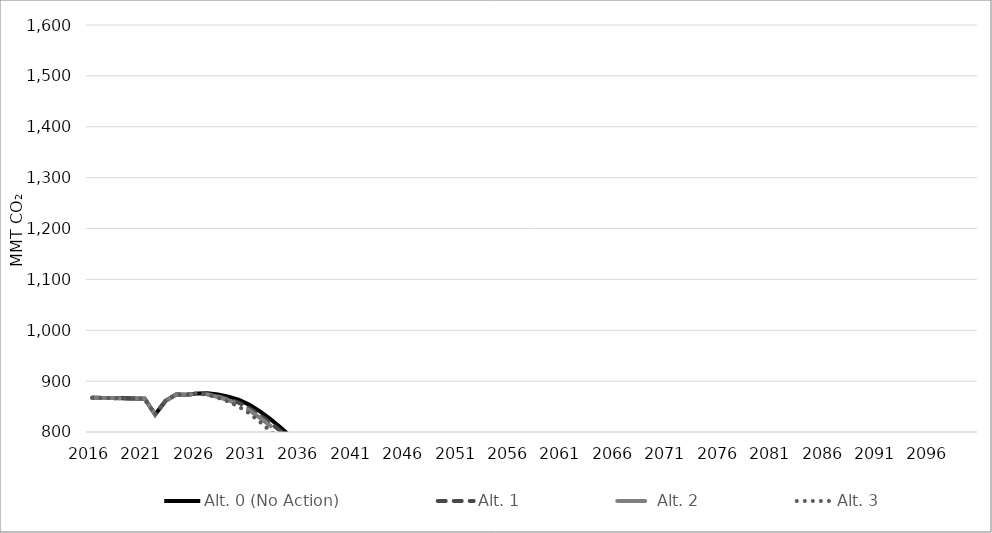
| Category | Alt. 0 (No Action) | Alt. 1 | Alt. 2 | Alt. 3 |
|---|---|---|---|---|
| 2016.0 | 867.375 | 867.375 | 867.375 | 867.375 |
| 2017.0 | 866.991 | 866.991 | 866.991 | 866.991 |
| 2018.0 | 866.606 | 866.606 | 866.606 | 866.606 |
| 2019.0 | 866.222 | 866.222 | 866.222 | 866.222 |
| 2020.0 | 865.838 | 865.838 | 865.838 | 865.838 |
| 2021.0 | 865.454 | 865.454 | 865.454 | 865.454 |
| 2022.0 | 834.271 | 834.271 | 834.271 | 834.271 |
| 2023.0 | 861.392 | 861.392 | 861.392 | 861.392 |
| 2024.0 | 873.777 | 873.777 | 873.777 | 873.777 |
| 2025.0 | 873.247 | 873.247 | 873.247 | 873.247 |
| 2026.0 | 875.583 | 875.583 | 875.583 | 875.583 |
| 2027.0 | 876.187 | 874.513 | 873.795 | 873.157 |
| 2028.0 | 873.704 | 870.343 | 868.748 | 867.291 |
| 2029.0 | 869.421 | 864.51 | 862.054 | 859.611 |
| 2030.0 | 863.177 | 857.358 | 854.022 | 849.724 |
| 2031.0 | 853.374 | 846.585 | 842.424 | 836.229 |
| 2032.0 | 840.499 | 832.85 | 827.79 | 819.822 |
| 2033.0 | 825.172 | 817.636 | 812.159 | 801.88 |
| 2034.0 | 808.401 | 801.258 | 795.371 | 782.746 |
| 2035.0 | 790.051 | 783.287 | 777.024 | 762.148 |
| 2036.0 | 772.213 | 765.639 | 759.127 | 741.909 |
| 2037.0 | 753.615 | 747.206 | 740.468 | 721.394 |
| 2038.0 | 735.428 | 729.408 | 722.591 | 701.757 |
| 2039.0 | 716.83 | 710.918 | 703.261 | 681.316 |
| 2040.0 | 696.609 | 690.644 | 682.365 | 659.487 |
| 2041.0 | 677.78 | 671.948 | 662.789 | 639.41 |
| 2042.0 | 659.316 | 653.775 | 644.041 | 619.892 |
| 2043.0 | 641.708 | 636.558 | 626.21 | 601.31 |
| 2044.0 | 623.161 | 618.299 | 607.033 | 581.859 |
| 2045.0 | 601.755 | 598.169 | 586.441 | 561.532 |
| 2046.0 | 579.557 | 577.342 | 565.676 | 540.185 |
| 2047.0 | 557.734 | 556.915 | 545.265 | 519.309 |
| 2048.0 | 536.37 | 537.001 | 525.39 | 498.676 |
| 2049.0 | 513.319 | 515.178 | 503.912 | 476.834 |
| 2050.0 | 489.345 | 492.167 | 481.575 | 454.411 |
| 2051.0 | 489.093 | 491.914 | 481.327 | 454.177 |
| 2052.0 | 488.842 | 491.661 | 481.08 | 453.944 |
| 2053.0 | 488.59 | 491.408 | 480.832 | 453.71 |
| 2054.0 | 488.339 | 491.155 | 480.585 | 453.477 |
| 2055.0 | 488.087 | 490.902 | 480.337 | 453.243 |
| 2056.0 | 487.836 | 490.65 | 480.09 | 453.01 |
| 2057.0 | 487.584 | 490.397 | 479.842 | 452.776 |
| 2058.0 | 487.333 | 490.144 | 479.595 | 452.542 |
| 2059.0 | 487.081 | 489.891 | 479.347 | 452.309 |
| 2060.0 | 486.83 | 489.638 | 479.1 | 452.075 |
| 2061.0 | 486.578 | 489.385 | 478.852 | 451.842 |
| 2062.0 | 486.327 | 489.132 | 478.605 | 451.608 |
| 2063.0 | 486.075 | 488.879 | 478.357 | 451.375 |
| 2064.0 | 485.824 | 488.626 | 478.11 | 451.141 |
| 2065.0 | 485.572 | 488.373 | 477.862 | 450.908 |
| 2066.0 | 485.427 | 488.227 | 477.72 | 450.773 |
| 2067.0 | 485.282 | 488.081 | 477.577 | 450.638 |
| 2068.0 | 485.137 | 487.935 | 477.434 | 450.504 |
| 2069.0 | 484.992 | 487.789 | 477.291 | 450.369 |
| 2070.0 | 484.847 | 487.644 | 477.149 | 450.234 |
| 2071.0 | 484.702 | 487.498 | 477.006 | 450.099 |
| 2072.0 | 484.557 | 487.352 | 476.863 | 449.965 |
| 2073.0 | 484.412 | 487.206 | 476.72 | 449.83 |
| 2074.0 | 484.267 | 487.06 | 476.578 | 449.695 |
| 2075.0 | 484.122 | 486.914 | 476.435 | 449.561 |
| 2076.0 | 483.977 | 486.768 | 476.292 | 449.426 |
| 2077.0 | 483.831 | 486.622 | 476.149 | 449.291 |
| 2078.0 | 483.686 | 486.476 | 476.007 | 449.157 |
| 2079.0 | 483.541 | 486.33 | 475.864 | 449.022 |
| 2080.0 | 483.396 | 486.185 | 475.721 | 448.887 |
| 2081.0 | 481.143 | 483.919 | 473.504 | 446.795 |
| 2082.0 | 478.89 | 481.653 | 471.287 | 444.703 |
| 2083.0 | 476.638 | 479.387 | 469.07 | 442.611 |
| 2084.0 | 474.385 | 477.121 | 466.852 | 440.519 |
| 2085.0 | 472.132 | 474.855 | 464.635 | 438.427 |
| 2086.0 | 469.879 | 472.589 | 462.418 | 436.335 |
| 2087.0 | 467.626 | 470.323 | 460.201 | 434.242 |
| 2088.0 | 465.373 | 468.057 | 457.984 | 432.15 |
| 2089.0 | 463.12 | 465.791 | 455.767 | 430.058 |
| 2090.0 | 460.867 | 463.525 | 453.55 | 427.966 |
| 2091.0 | 458.614 | 461.259 | 451.332 | 425.874 |
| 2092.0 | 456.361 | 458.994 | 449.115 | 423.782 |
| 2093.0 | 454.108 | 456.728 | 446.898 | 421.69 |
| 2094.0 | 451.855 | 454.462 | 444.681 | 419.598 |
| 2095.0 | 449.602 | 452.196 | 442.464 | 417.506 |
| 2096.0 | 449.602 | 452.196 | 442.464 | 417.506 |
| 2097.0 | 449.602 | 452.196 | 442.464 | 417.506 |
| 2098.0 | 449.602 | 452.196 | 442.464 | 417.506 |
| 2099.0 | 449.602 | 452.196 | 442.464 | 417.506 |
| 2100.0 | 449.602 | 452.196 | 442.464 | 417.506 |